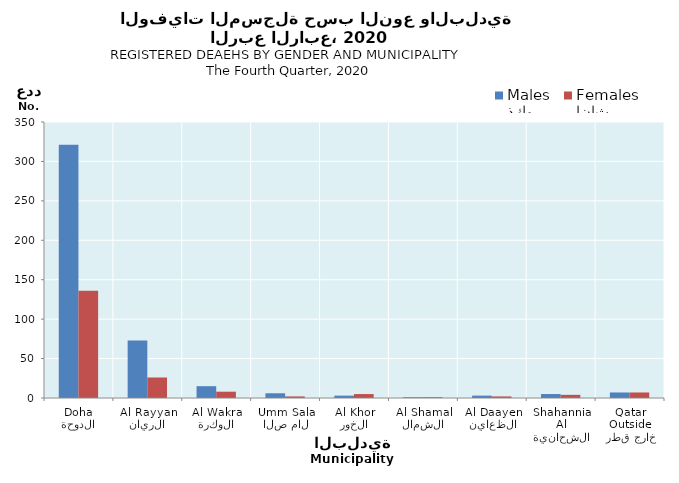
| Category | ذكور
Males | إناث
Females |
|---|---|---|
| الدوحة
Doha | 321 | 136 |
| الريان
Al Rayyan | 73 | 26 |
| الوكرة
Al Wakra | 15 | 8 |
| ام صلال
Umm Salal | 6 | 2 |
| الخور
Al Khor | 3 | 5 |
| الشمال
Al Shamal | 1 | 1 |
| الظعاين
Al Daayen | 3 | 2 |
| الشحانية
Al Shahannia | 5 | 4 |
| خارج قطر
Outside Qatar | 7 | 7 |